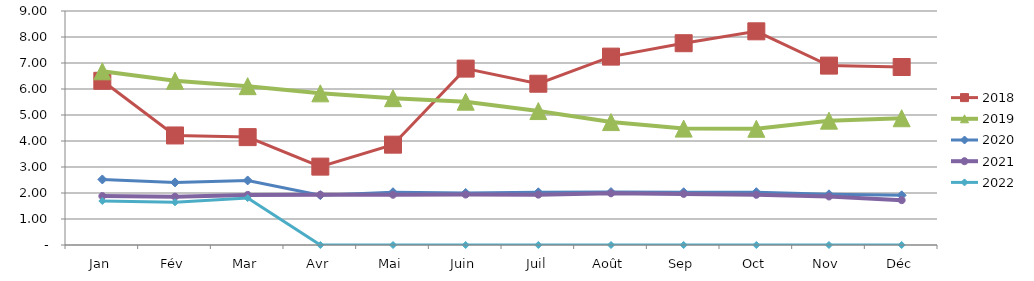
| Category | 2018 | 2019 | 2020 | 2021 | 2022 |
|---|---|---|---|---|---|
| Jan | 6.315 | 6.68 | 2.521 | 1.881 | 1.692 |
| Fév | 4.213 | 6.315 | 2.407 | 1.859 | 1.644 |
| Mar | 4.15 | 6.109 | 2.483 | 1.927 | 1.805 |
| Avr | 3.014 | 5.832 | 1.915 | 1.933 | 0 |
| Mai | 3.859 | 5.648 | 2.029 | 1.933 | 0 |
| Juin | 6.784 | 5.512 | 2.001 | 1.94 | 0 |
| Juil | 6.203 | 5.152 | 2.027 | 1.937 | 0 |
| Août | 7.245 | 4.728 | 2.036 | 1.987 | 0 |
| Sep | 7.761 | 4.477 | 2.029 | 1.965 | 0 |
| Oct | 8.218 | 4.47 | 2.032 | 1.931 | 0 |
| Nov | 6.9 | 4.782 | 1.95 | 1.865 | 0 |
| Déc | 6.846 | 4.875 | 1.91 | 1.725 | 0 |